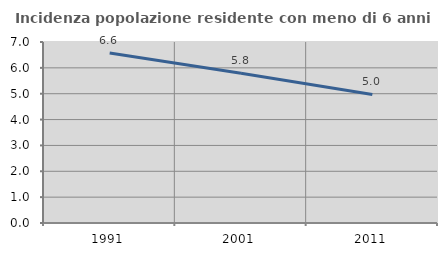
| Category | Incidenza popolazione residente con meno di 6 anni |
|---|---|
| 1991.0 | 6.575 |
| 2001.0 | 5.788 |
| 2011.0 | 4.973 |